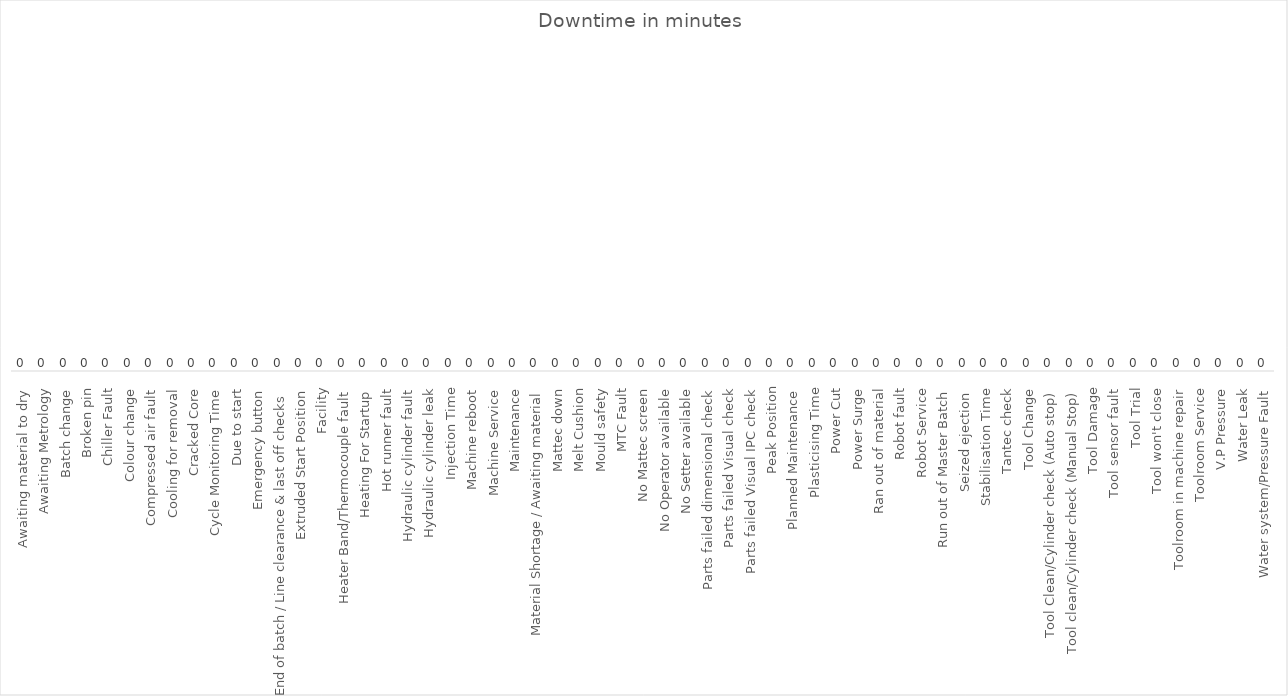
| Category | Series 0 |
|---|---|
| Awaiting material to dry | 0 |
| Awaiting Metrology | 0 |
| Batch change | 0 |
| Broken pin | 0 |
| Chiller Fault | 0 |
| Colour change | 0 |
| Compressed air fault | 0 |
| Cooling for removal | 0 |
| Cracked Core | 0 |
| Cycle Monitoring Time | 0 |
| Due to start | 0 |
| Emergency button | 0 |
| End of batch / Line clearance & last off checks | 0 |
| Extruded Start Position | 0 |
| Facility | 0 |
| Heater Band/Thermocouple fault | 0 |
| Heating For Startup | 0 |
| Hot runner fault | 0 |
| Hydraulic cylinder fault | 0 |
| Hydraulic cylinder leak | 0 |
| Injection Time | 0 |
| Machine reboot | 0 |
| Machine Service | 0 |
| Maintenance | 0 |
| Material Shortage / Awaiting material | 0 |
| Mattec down | 0 |
| Melt Cushion | 0 |
| Mould safety | 0 |
| MTC Fault | 0 |
| No Mattec screen | 0 |
| No Operator available | 0 |
| No Setter available | 0 |
| Parts failed dimensional check | 0 |
| Parts failed Visual check | 0 |
| Parts failed Visual IPC check | 0 |
| Peak Position | 0 |
| Planned Maintenance | 0 |
| Plasticising Time | 0 |
| Power Cut | 0 |
| Power Surge | 0 |
| Ran out of material | 0 |
| Robot fault | 0 |
| Robot Service | 0 |
| Run out of Master Batch | 0 |
| Seized ejection  | 0 |
| Stabilisation Time | 0 |
| Tantec check | 0 |
| Tool Change | 0 |
| Tool Clean/Cylinder check (Auto stop) | 0 |
| Tool clean/Cylinder check (Manual Stop) | 0 |
| Tool Damage | 0 |
| Tool sensor fault | 0 |
| Tool Trial | 0 |
| Tool won't close | 0 |
| Toolroom in machine repair | 0 |
| Toolroom Service | 0 |
| V.P Pressure | 0 |
| Water Leak | 0 |
| Water system/Pressure Fault | 0 |